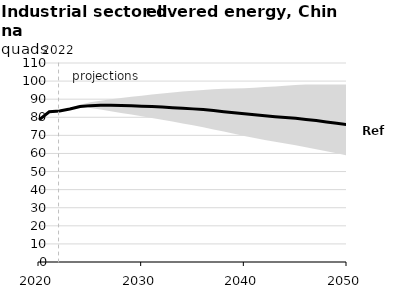
| Category | Ref |
|---|---|
| 2020.0 | 78.595 |
| 2021.0 | 83.021 |
| 2022.0 | 83.525 |
| 2023.0 | 84.597 |
| 2024.0 | 85.923 |
| 2025.0 | 86.436 |
| 2026.0 | 86.602 |
| 2027.0 | 86.655 |
| 2028.0 | 86.475 |
| 2029.0 | 86.323 |
| 2030.0 | 86.152 |
| 2031.0 | 85.902 |
| 2032.0 | 85.654 |
| 2033.0 | 85.308 |
| 2034.0 | 85.01 |
| 2035.0 | 84.641 |
| 2036.0 | 84.239 |
| 2037.0 | 83.725 |
| 2038.0 | 83.106 |
| 2039.0 | 82.492 |
| 2040.0 | 81.922 |
| 2041.0 | 81.37 |
| 2042.0 | 80.841 |
| 2043.0 | 80.306 |
| 2044.0 | 79.872 |
| 2045.0 | 79.408 |
| 2046.0 | 78.828 |
| 2047.0 | 78.154 |
| 2048.0 | 77.432 |
| 2049.0 | 76.701 |
| 2050.0 | 75.979 |